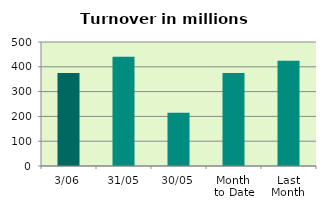
| Category | Series 0 |
|---|---|
| 3/06 | 374.718 |
| 31/05 | 440.848 |
| 30/05 | 214.474 |
| Month 
to Date | 374.718 |
| Last
Month | 424.091 |